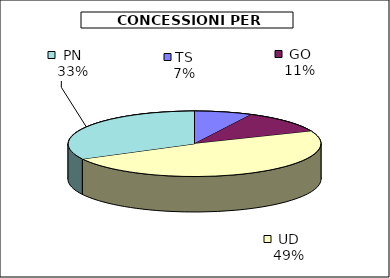
| Category | Series 0 |
|---|---|
| TS | 5760000 |
| GO | 8829000 |
| UD | 37669250 |
| PN | 25365700 |